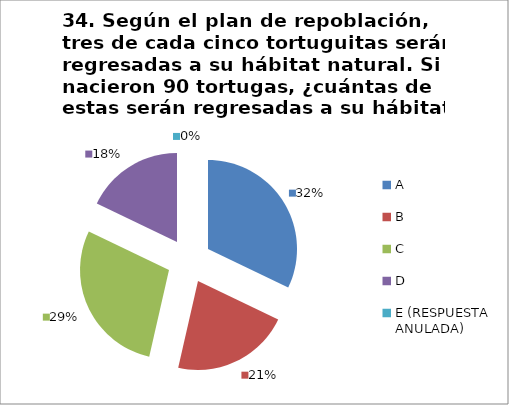
| Category | CANTIDAD DE RESPUESTAS PREGUNTA (34) | PORCENTAJE |
|---|---|---|
| A | 9 | 0.321 |
| B | 6 | 0.214 |
| C | 8 | 0.286 |
| D | 5 | 0.179 |
| E (RESPUESTA ANULADA) | 0 | 0 |